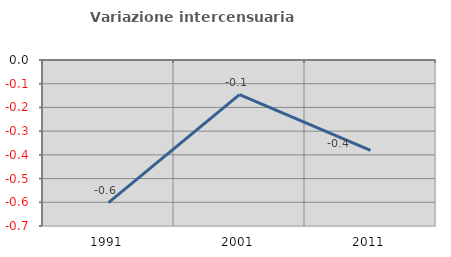
| Category | Variazione intercensuaria annua |
|---|---|
| 1991.0 | -0.602 |
| 2001.0 | -0.146 |
| 2011.0 | -0.381 |